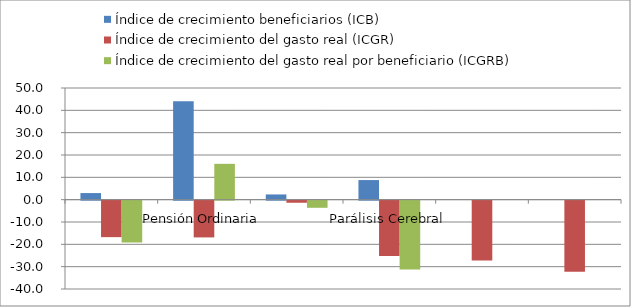
| Category | Índice de crecimiento beneficiarios (ICB)  | Índice de crecimiento del gasto real (ICGR)  | Índice de crecimiento del gasto real por beneficiario (ICGRB)  |
|---|---|---|---|
|  | 2.953 | -16.332 | -18.732 |
| Pensión Ordinaria | 44.075 | -16.455 | 16.042 |
|  | 2.336 | -0.934 | -3.195 |
| Parálisis Cerebral | 8.775 | -24.75 | -30.82 |